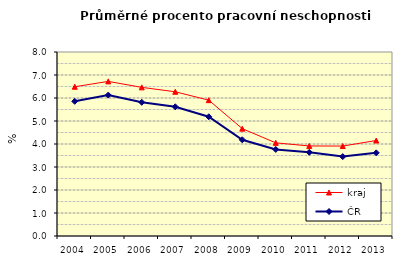
| Category | kraj | ČR |
|---|---|---|
| 2004.0 | 6.489 | 5.857 |
| 2005.0 | 6.722 | 6.126 |
| 2006.0 | 6.462 | 5.814 |
| 2007.0 | 6.271 | 5.619 |
| 2008.0 | 5.906 | 5.184 |
| 2009.0 | 4.667 | 4.184 |
| 2010.0 | 4.05 | 3.763 |
| 2011.0 | 3.915 | 3.638 |
| 2012.0 | 3.911 | 3.452 |
| 2013.0 | 4.152 | 3.615 |